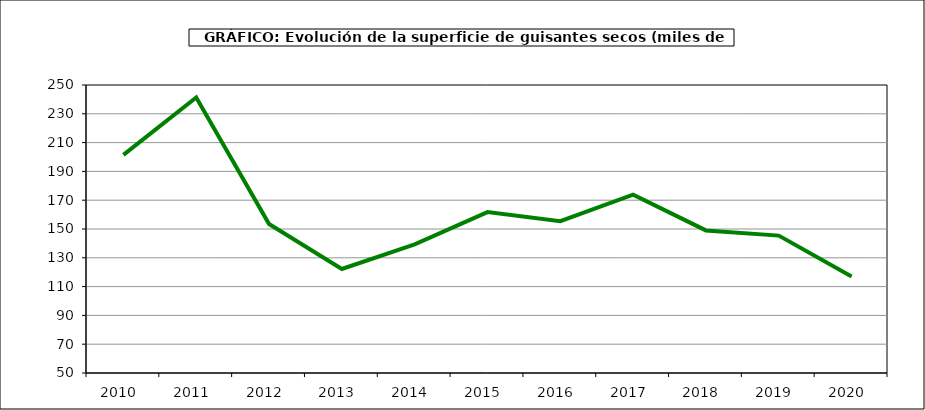
| Category | Superficie |
|---|---|
| 2010.0 | 201.458 |
| 2011.0 | 241.347 |
| 2012.0 | 153.482 |
| 2013.0 | 122.246 |
| 2014.0 | 139.386 |
| 2015.0 | 161.746 |
| 2016.0 | 155.409 |
| 2017.0 | 173.854 |
| 2018.0 | 149.02 |
| 2019.0 | 145.399 |
| 2020.0 | 116.993 |